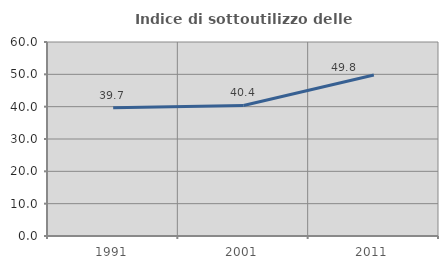
| Category | Indice di sottoutilizzo delle abitazioni  |
|---|---|
| 1991.0 | 39.663 |
| 2001.0 | 40.362 |
| 2011.0 | 49.795 |